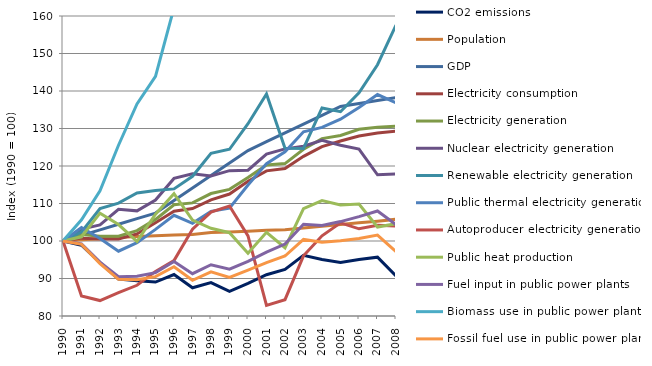
| Category | CO2 emissions | Population | GDP | Electricity consumption | Electricity generation | Nuclear electricity generation | Renewable electricity generation | Public thermal electricity generation | Autoproducer electricity generation | Public heat production | Fuel input in public power plants  | Biomass use in public power plants  | Fossil fuel use in public power plants  |
|---|---|---|---|---|---|---|---|---|---|---|---|---|---|
| 1990.0 | 100 | 100 | 100 | 100 | 100 | 100 | 100 | 100 | 100 | 100 | 100 | 100 | 100 |
| 1991.0 | 98.875 | 100.336 | 101.488 | 100.764 | 101.701 | 103.165 | 102.409 | 103.596 | 85.363 | 101.125 | 99.236 | 105.638 | 99.103 |
| 1992.0 | 94.206 | 100.607 | 102.976 | 100.51 | 101.267 | 104.291 | 108.637 | 100.654 | 84.118 | 107.42 | 94.37 | 113.373 | 93.975 |
| 1993.0 | 89.825 | 100.954 | 104.464 | 100.537 | 101.28 | 108.433 | 110.101 | 97.29 | 86.211 | 104.381 | 90.497 | 125.533 | 89.769 |
| 1994.0 | 89.421 | 101.207 | 105.952 | 101.887 | 102.765 | 108.038 | 112.826 | 99.573 | 88.19 | 99.888 | 90.615 | 136.533 | 89.661 |
| 1995.0 | 89.055 | 101.408 | 107.439 | 104.872 | 105.762 | 110.938 | 113.45 | 103.094 | 91.893 | 107.159 | 91.573 | 143.881 | 90.486 |
| 1996.0 | 91.057 | 101.588 | 110.777 | 107.926 | 109.654 | 116.691 | 113.89 | 106.848 | 94.788 | 112.629 | 94.557 | 162.212 | 93.151 |
| 1997.0 | 87.534 | 101.752 | 114.114 | 108.648 | 110.159 | 117.924 | 117.256 | 104.727 | 103.165 | 105.563 | 91.275 | 175.273 | 89.529 |
| 1998.0 | 88.886 | 102.239 | 117.451 | 110.972 | 112.656 | 117.358 | 123.377 | 107.895 | 107.698 | 103.393 | 93.671 | 184.548 | 91.782 |
| 1999.0 | 86.585 | 102.387 | 120.789 | 112.523 | 113.772 | 118.754 | 124.463 | 108.745 | 109.327 | 102.218 | 92.496 | 198.907 | 90.284 |
| 2000.0 | 88.685 | 102.632 | 124.126 | 115.947 | 116.922 | 118.886 | 131.275 | 114.948 | 101.36 | 96.741 | 94.555 | 207.21 | 92.214 |
| 2001.0 | 91.012 | 102.851 | 126.474 | 118.705 | 120.293 | 123.162 | 139.215 | 120.63 | 82.818 | 102.322 | 97.04 | 232.381 | 94.227 |
| 2002.0 | 92.398 | 103.029 | 128.822 | 119.335 | 120.638 | 124.573 | 124.738 | 123.78 | 84.345 | 98.204 | 99.196 | 252.946 | 96.001 |
| 2003.0 | 96.184 | 103.457 | 131.17 | 122.577 | 124.477 | 125.285 | 124.688 | 129.136 | 96.052 | 108.655 | 104.462 | 299.262 | 100.414 |
| 2004.0 | 95.07 | 103.914 | 133.518 | 125.149 | 127.306 | 126.867 | 135.485 | 130.308 | 101.381 | 110.79 | 104.145 | 319.878 | 99.662 |
| 2005.0 | 94.29 | 104.415 | 135.866 | 126.668 | 128.125 | 125.516 | 134.482 | 132.481 | 104.838 | 109.618 | 105.18 | 350.656 | 100.079 |
| 2006.0 | 95.095 | 104.855 | 136.658 | 128.014 | 129.794 | 124.532 | 139.514 | 135.599 | 103.248 | 109.836 | 106.503 | 386.544 | 100.684 |
| 2007.0 | 95.684 | 105.297 | 137.45 | 128.822 | 130.343 | 117.663 | 147.009 | 139.061 | 104.213 | 103.718 | 107.999 | 416.86 | 101.581 |
| 2008.0 | 90.687 | 105.795 | 138.242 | 129.298 | 130.594 | 117.91 | 157.585 | 136.829 | 103.961 | 104.621 | 104.385 | 451.073 | 97.181 |